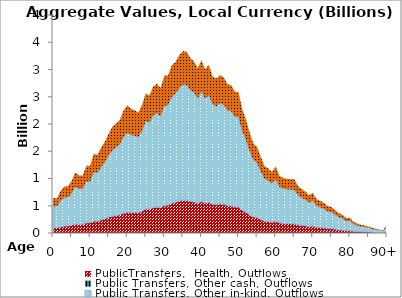
| Category | PublicTransfers,  Health, Outflows | Public Transfers, Other cash, Outflows | Public Transfers, Other in-kind, Outflows | Public Transfers, Education, Outflows |
|---|---|---|---|---|
| 0 | 96.57 |  | 395.162 | 151.223 |
|  | 95.065 |  | 389.142 | 148.892 |
| 2 | 115.073 |  | 471.274 | 180.273 |
| 3 | 128.037 |  | 524.444 | 200.597 |
| 4 | 128.393 |  | 525.764 | 201.128 |
| 5 | 142.995 |  | 585.629 | 224.015 |
| 6 | 166.839 |  | 683.536 | 261.416 |
| 7 | 158.532 |  | 649.147 | 248.328 |
| 8 | 158.473 |  | 648.359 | 247.915 |
| 9 | 186.885 |  | 761.127 | 288.881 |
| 10 | 187.645 |  | 757.879 | 284.366 |
| 11 | 222.029 |  | 896.233 | 335.715 |
| 12 | 219.372 |  | 884.204 | 330.753 |
| 13 | 241.919 |  | 971.308 | 361.144 |
| 14 | 263.028 |  | 1038.574 | 376.274 |
| 15 | 290.927 |  | 1133.615 | 401.778 |
| 16 | 309.617 |  | 1208.782 | 429.746 |
| 17 | 321.55 |  | 1249.734 | 441.07 |
| 18 | 334.708 |  | 1291.364 | 450.328 |
| 19 | 362.869 |  | 1396.696 | 484.695 |
| 20 | 381.703 |  | 1460.737 | 501.774 |
| 21 | 375.359 |  | 1423.646 | 481.194 |
| 22 | 376.433 |  | 1410.584 | 466.372 |
| 23 | 374.133 |  | 1386.946 | 449.36 |
| 24 | 400.529 |  | 1477.227 | 473.528 |
| 25 | 441.181 |  | 1614.653 | 509.517 |
| 26 | 437.458 |  | 1589.369 | 494.134 |
| 27 | 465.953 |  | 1695.014 | 528.142 |
| 28 | 473.749 |  | 1725.101 | 538.53 |
| 29 | 464.672 |  | 1681.175 | 517.81 |
| 30 | 508.284 |  | 1825.549 | 553.412 |
| 31 | 512.881 |  | 1830.903 | 547.409 |
| 32 | 550.043 |  | 1951.056 | 574.903 |
| 33 | 563.565 |  | 1993.184 | 583.336 |
| 34 | 586.299 |  | 2070.169 | 603.364 |
| 35 | 603.62 |  | 2121.275 | 611.542 |
| 36 | 602.182 |  | 2115.482 | 609.33 |
| 37 | 582.141 |  | 2041.339 | 585.605 |
| 38 | 571.479 |  | 2003.085 | 574.061 |
| 39 | 548.672 |  | 1922.737 | 550.821 |
| 40 | 577.133 |  | 2018.156 | 575.31 |
| 41 | 549.145 |  | 1914.556 | 542.019 |
| 42 | 564.416 |  | 1966.08 | 555.592 |
| 43 | 526.734 |  | 1833.527 | 517.387 |
| 44 | 519.903 |  | 1805.692 | 506.906 |
| 45 | 533.736 |  | 1847.785 | 514.738 |
| 46 | 527.209 |  | 1823.922 | 507.206 |
| 47 | 504.726 |  | 1742.588 | 482.25 |
| 48 | 502.183 |  | 1733.863 | 479.959 |
| 49 | 479.772 |  | 1656.146 | 458.266 |
| 50 | 476.579 |  | 1647.339 | 457.448 |
| 51 | 417.168 |  | 1446.589 | 404.92 |
| 52 | 381.315 |  | 1328.702 | 376.381 |
| 53 | 333.866 |  | 1168.837 | 334.946 |
| 54 | 296.459 |  | 1042.229 | 301.772 |
| 55 | 283.688 |  | 1001.53 | 292.996 |
| 56 | 249.725 |  | 884.852 | 261.176 |
| 57 | 218.137 |  | 775.97 | 231.176 |
| 58 | 210.103 |  | 750.557 | 225.783 |
| 59 | 197.335 |  | 706.574 | 213.737 |
| 60 | 215.282 |  | 772.751 | 235.112 |
| 61 | 184.782 |  | 664.251 | 202.791 |
| 62 | 177.36 |  | 637.724 | 194.852 |
| 63 | 175.135 |  | 629.138 | 191.908 |
| 64 | 173.551 |  | 623.749 | 190.527 |
| 65 | 173.733 |  | 624.492 | 190.896 |
| 66 | 151.588 |  | 545.166 | 166.899 |
| 67 | 141.345 |  | 508.275 | 155.651 |
| 68 | 133.171 |  | 479.58 | 147.36 |
| 69 | 120.809 |  | 435.907 | 134.501 |
| 70 | 128.765 |  | 464.879 | 143.651 |
| 71 | 108.423 |  | 391.562 | 121.1 |
| 72 | 103.064 |  | 372.531 | 115.462 |
| 73 | 96.019 |  | 347.384 | 107.915 |
| 74 | 86.198 |  | 312.247 | 97.294 |
| 75 | 82.725 |  | 300.096 | 93.821 |
| 76 | 73.26 |  | 266.332 | 83.67 |
| 77 | 62.772 |  | 229.011 | 72.495 |
| 78 | 57.295 |  | 209.827 | 66.964 |
| 79 | 46.904 |  | 172.408 | 55.449 |
| 80 | 47.609 |  | 175.584 | 56.864 |
| 81 | 34.133 |  | 126.389 | 41.267 |
| 82 | 29.392 |  | 109.215 | 35.912 |
| 83 | 24.907 |  | 92.901 | 30.778 |
| 84 | 22.788 |  | 85.346 | 28.502 |
| 85 | 19.966 |  | 75.13 | 25.313 |
| 86 | 15.928 |  | 60.216 | 20.467 |
| 87 | 12.557 |  | 47.694 | 16.352 |
| 88 | 10.02 |  | 38.229 | 13.217 |
| 89 | 7.805 |  | 29.913 | 10.426 |
| 90+ | 27.265 |  | 104.82 | 36.74 |